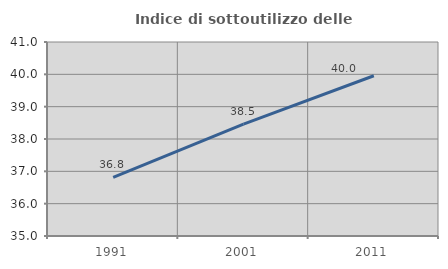
| Category | Indice di sottoutilizzo delle abitazioni  |
|---|---|
| 1991.0 | 36.812 |
| 2001.0 | 38.462 |
| 2011.0 | 39.957 |